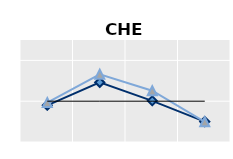
| Category | Né à l'étranger | Né dans le pays | Series 1 |
|---|---|---|---|
| 15-24 | 0.899 | 0.965 | 1 |
| 25-54 | 1.462 | 1.66 | 1 |
| 55-64 | 1.009 | 1.257 | 1 |
| 65+ | 0.499 | 0.496 | 1 |